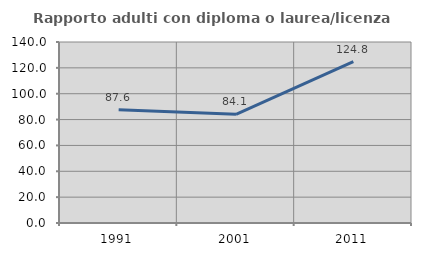
| Category | Rapporto adulti con diploma o laurea/licenza media  |
|---|---|
| 1991.0 | 87.634 |
| 2001.0 | 84.098 |
| 2011.0 | 124.841 |